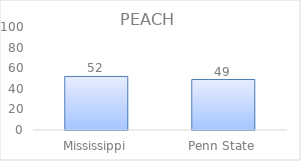
| Category | Series 0 |
|---|---|
| Mississippi | 52 |
| Penn State | 49 |